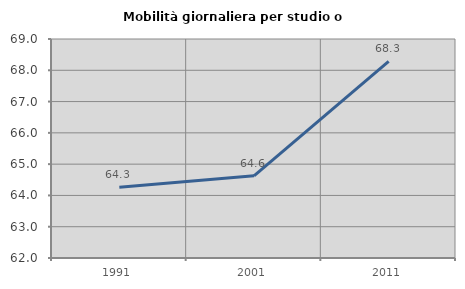
| Category | Mobilità giornaliera per studio o lavoro |
|---|---|
| 1991.0 | 64.263 |
| 2001.0 | 64.627 |
| 2011.0 | 68.287 |